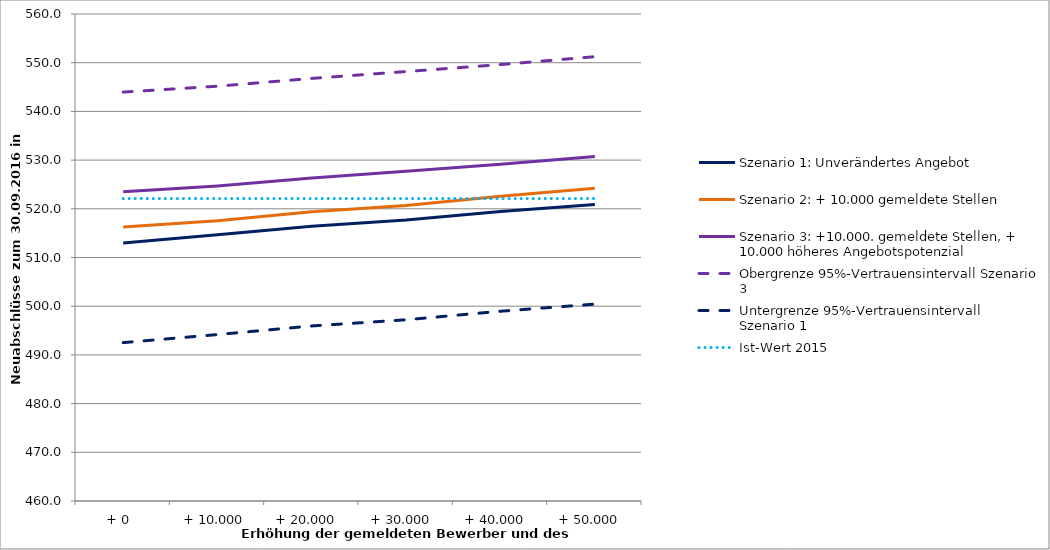
| Category | Szenario 1: Unverändertes Angebot | Szenario 2: + 10.000 gemeldete Stellen | Szenario 3: +10.000. gemeldete Stellen, + 10.000 höheres Angebotspotenzial | Obergrenze 95%-Vertrauensintervall Szenario 3 | Untergrenze 95%-Vertrauensintervall Szenario 1 | Ist-Wert 2015 |
|---|---|---|---|---|---|---|
| + 0  | 513 | 516.28 | 523.49 | 543.965 | 492.525 | 522.1 |
| + 10.000 | 514.65 | 517.539 | 524.7 | 545.175 | 494.175 | 522.1 |
| + 20.000  | 516.42 | 519.39 | 526.3 | 546.775 | 495.945 | 522.1 |
| + 30.000  | 517.69 | 520.67 | 527.71 | 548.185 | 497.215 | 522.1 |
| + 40.000  | 519.44 | 522.6 | 529.14 | 549.615 | 498.965 | 522.1 |
| + 50.000  | 520.905 | 524.2 | 530.76 | 551.235 | 500.43 | 522.1 |